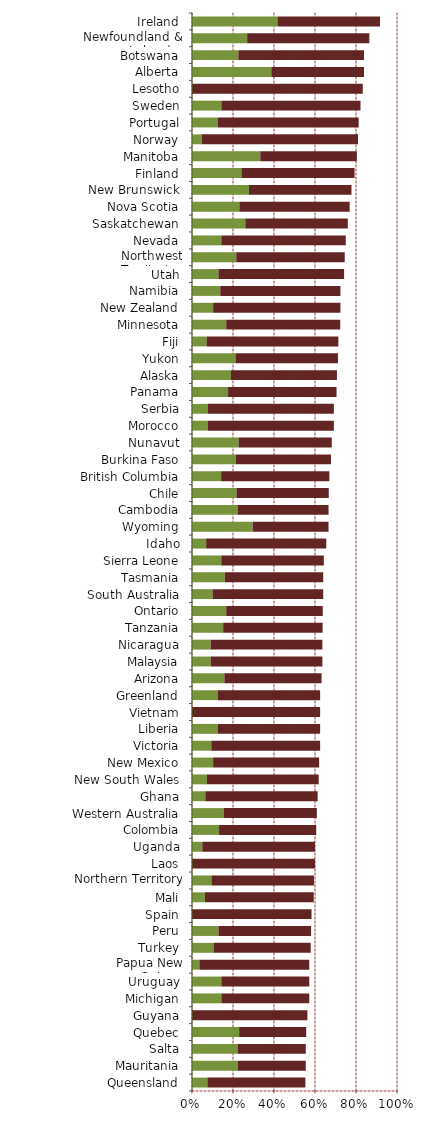
| Category | Series 0 | Series 1 |
|---|---|---|
| Queensland | 0.075 | 0.478 |
| Mauritania | 0.222 | 0.333 |
| Salta | 0.222 | 0.333 |
| Quebec | 0.23 | 0.327 |
| Guyana | 0 | 0.563 |
| Michigan | 0.143 | 0.429 |
| Uruguay | 0.143 | 0.429 |
| Papua New Guinea | 0.036 | 0.536 |
| Turkey | 0.105 | 0.474 |
| Peru | 0.129 | 0.452 |
| Spain | 0 | 0.583 |
| Mali | 0.063 | 0.531 |
| Northern Territory | 0.095 | 0.5 |
| Laos | 0 | 0.6 |
| Uganda | 0.05 | 0.55 |
| Colombia | 0.132 | 0.474 |
| Western Australia | 0.156 | 0.453 |
| Ghana | 0.065 | 0.548 |
| New South Wales | 0.073 | 0.545 |
| New Mexico | 0.103 | 0.517 |
| Victoria | 0.094 | 0.531 |
| Liberia | 0.125 | 0.5 |
| Vietnam | 0 | 0.625 |
| Greenland | 0.125 | 0.5 |
| Arizona | 0.158 | 0.474 |
| Malaysia | 0.091 | 0.545 |
| Nicaragua | 0.091 | 0.545 |
| Tanzania | 0.152 | 0.485 |
| Ontario | 0.167 | 0.471 |
| South Australia | 0.1 | 0.54 |
| Tasmania | 0.16 | 0.48 |
| Sierra Leone | 0.143 | 0.5 |
| Idaho | 0.069 | 0.586 |
| Wyoming | 0.296 | 0.37 |
| Cambodia | 0.222 | 0.444 |
| Chile | 0.217 | 0.45 |
| British Columbia | 0.142 | 0.528 |
| Burkina Faso | 0.214 | 0.464 |
| Nunavut | 0.227 | 0.455 |
| Morocco | 0.077 | 0.615 |
| Serbia | 0.077 | 0.615 |
| Panama | 0.176 | 0.529 |
| Alaska | 0.19 | 0.517 |
| Yukon | 0.212 | 0.5 |
| Fiji | 0.071 | 0.643 |
| Minnesota | 0.167 | 0.556 |
| New Zealand | 0.103 | 0.621 |
| Namibia | 0.138 | 0.586 |
| Utah | 0.129 | 0.613 |
| Northwest Territories | 0.216 | 0.529 |
| Nevada | 0.143 | 0.607 |
| Saskatchewan | 0.26 | 0.5 |
| Nova Scotia | 0.231 | 0.538 |
| New Brunswick | 0.278 | 0.5 |
| Finland | 0.241 | 0.552 |
| Manitoba | 0.333 | 0.471 |
| Norway | 0.048 | 0.762 |
| Portugal | 0.125 | 0.688 |
| Sweden | 0.143 | 0.679 |
| Lesotho | 0 | 0.833 |
| Alberta | 0.387 | 0.452 |
| Botswana | 0.226 | 0.613 |
| Newfoundland & Labrador | 0.269 | 0.596 |
| Ireland | 0.417 | 0.5 |